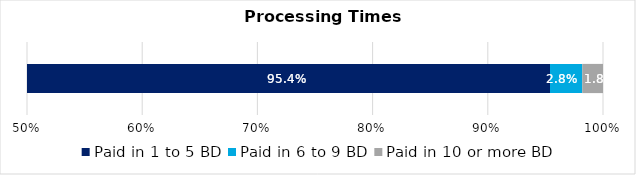
| Category | Paid in 1 to 5 BD | Paid in 6 to 9 BD | Paid in 10 or more BD |
|---|---|---|---|
| 0 | 0.954 | 0.028 | 0.018 |